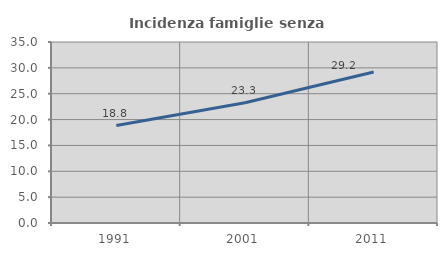
| Category | Incidenza famiglie senza nuclei |
|---|---|
| 1991.0 | 18.838 |
| 2001.0 | 23.261 |
| 2011.0 | 29.19 |